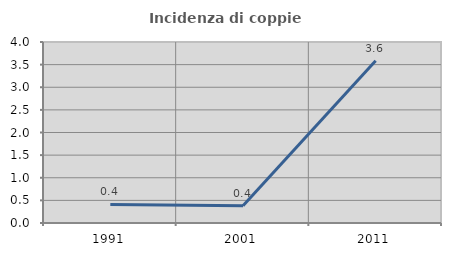
| Category | Incidenza di coppie miste |
|---|---|
| 1991.0 | 0.41 |
| 2001.0 | 0.38 |
| 2011.0 | 3.584 |